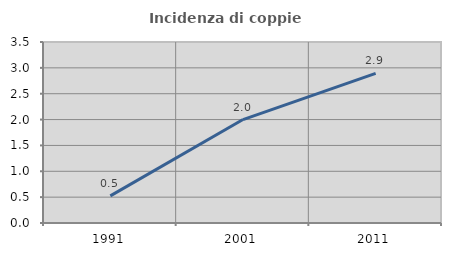
| Category | Incidenza di coppie miste |
|---|---|
| 1991.0 | 0.524 |
| 2001.0 | 2 |
| 2011.0 | 2.894 |